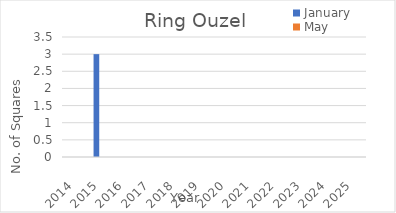
| Category | January | May |
|---|---|---|
| 2014.0 | 0 | 0 |
| 2015.0 | 3 | 0 |
| 2016.0 | 0 | 0 |
| 2017.0 | 0 | 0 |
| 2018.0 | 0 | 0 |
| 2019.0 | 0 | 0 |
| 2020.0 | 0 | 0 |
| 2021.0 | 0 | 0 |
| 2022.0 | 0 | 0 |
| 2023.0 | 0 | 0 |
| 2024.0 | 0 | 0 |
| 2025.0 | 0 | 0 |